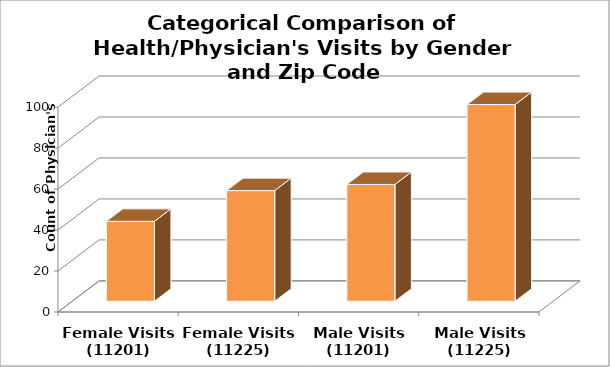
| Category | Series 0 |
|---|---|
| Female Visits (11201) | 39 |
| Female Visits (11225) | 54 |
| Male Visits (11201) | 57 |
| Male Visits (11225) | 96 |